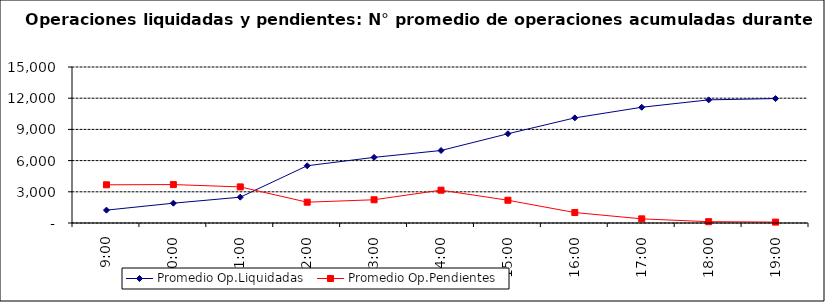
| Category | Promedio Op.Liquidadas | Promedio Op.Pendientes |
|---|---|---|
| 0.375 | 1237.095 | 3672.143 |
| 0.4166666666666667 | 1906.095 | 3694.619 |
| 0.4583333333333333 | 2482 | 3471.095 |
| 0.5 | 5505.429 | 2000.571 |
| 0.5416666666666666 | 6310.238 | 2235.048 |
| 0.5833333333333334 | 6970.81 | 3157.048 |
| 0.625 | 8580.286 | 2187.286 |
| 0.6666666666666666 | 10107.524 | 1005.286 |
| 0.7083333333333334 | 11129.619 | 398.429 |
| 0.75 | 11839.381 | 126.238 |
| 0.7916666666666666 | 11964.381 | 85.905 |